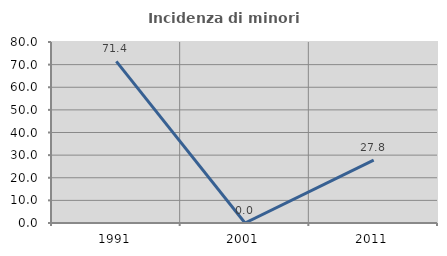
| Category | Incidenza di minori stranieri |
|---|---|
| 1991.0 | 71.429 |
| 2001.0 | 0 |
| 2011.0 | 27.778 |